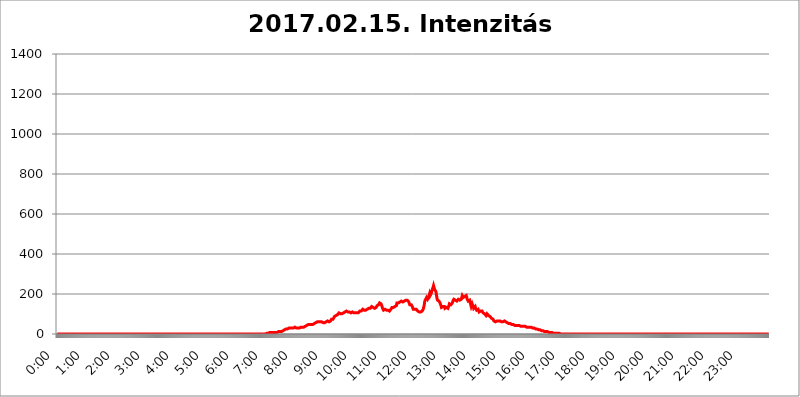
| Category | 2017.02.15. Intenzitás [W/m^2] |
|---|---|
| 0.0 | 0 |
| 0.0006944444444444445 | 0 |
| 0.001388888888888889 | 0 |
| 0.0020833333333333333 | 0 |
| 0.002777777777777778 | 0 |
| 0.003472222222222222 | 0 |
| 0.004166666666666667 | 0 |
| 0.004861111111111111 | 0 |
| 0.005555555555555556 | 0 |
| 0.0062499999999999995 | 0 |
| 0.006944444444444444 | 0 |
| 0.007638888888888889 | 0 |
| 0.008333333333333333 | 0 |
| 0.009027777777777779 | 0 |
| 0.009722222222222222 | 0 |
| 0.010416666666666666 | 0 |
| 0.011111111111111112 | 0 |
| 0.011805555555555555 | 0 |
| 0.012499999999999999 | 0 |
| 0.013194444444444444 | 0 |
| 0.013888888888888888 | 0 |
| 0.014583333333333332 | 0 |
| 0.015277777777777777 | 0 |
| 0.015972222222222224 | 0 |
| 0.016666666666666666 | 0 |
| 0.017361111111111112 | 0 |
| 0.018055555555555557 | 0 |
| 0.01875 | 0 |
| 0.019444444444444445 | 0 |
| 0.02013888888888889 | 0 |
| 0.020833333333333332 | 0 |
| 0.02152777777777778 | 0 |
| 0.022222222222222223 | 0 |
| 0.02291666666666667 | 0 |
| 0.02361111111111111 | 0 |
| 0.024305555555555556 | 0 |
| 0.024999999999999998 | 0 |
| 0.025694444444444447 | 0 |
| 0.02638888888888889 | 0 |
| 0.027083333333333334 | 0 |
| 0.027777777777777776 | 0 |
| 0.02847222222222222 | 0 |
| 0.029166666666666664 | 0 |
| 0.029861111111111113 | 0 |
| 0.030555555555555555 | 0 |
| 0.03125 | 0 |
| 0.03194444444444445 | 0 |
| 0.03263888888888889 | 0 |
| 0.03333333333333333 | 0 |
| 0.034027777777777775 | 0 |
| 0.034722222222222224 | 0 |
| 0.035416666666666666 | 0 |
| 0.036111111111111115 | 0 |
| 0.03680555555555556 | 0 |
| 0.0375 | 0 |
| 0.03819444444444444 | 0 |
| 0.03888888888888889 | 0 |
| 0.03958333333333333 | 0 |
| 0.04027777777777778 | 0 |
| 0.04097222222222222 | 0 |
| 0.041666666666666664 | 0 |
| 0.042361111111111106 | 0 |
| 0.04305555555555556 | 0 |
| 0.043750000000000004 | 0 |
| 0.044444444444444446 | 0 |
| 0.04513888888888889 | 0 |
| 0.04583333333333334 | 0 |
| 0.04652777777777778 | 0 |
| 0.04722222222222222 | 0 |
| 0.04791666666666666 | 0 |
| 0.04861111111111111 | 0 |
| 0.049305555555555554 | 0 |
| 0.049999999999999996 | 0 |
| 0.05069444444444445 | 0 |
| 0.051388888888888894 | 0 |
| 0.052083333333333336 | 0 |
| 0.05277777777777778 | 0 |
| 0.05347222222222222 | 0 |
| 0.05416666666666667 | 0 |
| 0.05486111111111111 | 0 |
| 0.05555555555555555 | 0 |
| 0.05625 | 0 |
| 0.05694444444444444 | 0 |
| 0.057638888888888885 | 0 |
| 0.05833333333333333 | 0 |
| 0.05902777777777778 | 0 |
| 0.059722222222222225 | 0 |
| 0.06041666666666667 | 0 |
| 0.061111111111111116 | 0 |
| 0.06180555555555556 | 0 |
| 0.0625 | 0 |
| 0.06319444444444444 | 0 |
| 0.06388888888888888 | 0 |
| 0.06458333333333334 | 0 |
| 0.06527777777777778 | 0 |
| 0.06597222222222222 | 0 |
| 0.06666666666666667 | 0 |
| 0.06736111111111111 | 0 |
| 0.06805555555555555 | 0 |
| 0.06874999999999999 | 0 |
| 0.06944444444444443 | 0 |
| 0.07013888888888889 | 0 |
| 0.07083333333333333 | 0 |
| 0.07152777777777779 | 0 |
| 0.07222222222222223 | 0 |
| 0.07291666666666667 | 0 |
| 0.07361111111111111 | 0 |
| 0.07430555555555556 | 0 |
| 0.075 | 0 |
| 0.07569444444444444 | 0 |
| 0.0763888888888889 | 0 |
| 0.07708333333333334 | 0 |
| 0.07777777777777778 | 0 |
| 0.07847222222222222 | 0 |
| 0.07916666666666666 | 0 |
| 0.0798611111111111 | 0 |
| 0.08055555555555556 | 0 |
| 0.08125 | 0 |
| 0.08194444444444444 | 0 |
| 0.08263888888888889 | 0 |
| 0.08333333333333333 | 0 |
| 0.08402777777777777 | 0 |
| 0.08472222222222221 | 0 |
| 0.08541666666666665 | 0 |
| 0.08611111111111112 | 0 |
| 0.08680555555555557 | 0 |
| 0.08750000000000001 | 0 |
| 0.08819444444444445 | 0 |
| 0.08888888888888889 | 0 |
| 0.08958333333333333 | 0 |
| 0.09027777777777778 | 0 |
| 0.09097222222222222 | 0 |
| 0.09166666666666667 | 0 |
| 0.09236111111111112 | 0 |
| 0.09305555555555556 | 0 |
| 0.09375 | 0 |
| 0.09444444444444444 | 0 |
| 0.09513888888888888 | 0 |
| 0.09583333333333333 | 0 |
| 0.09652777777777777 | 0 |
| 0.09722222222222222 | 0 |
| 0.09791666666666667 | 0 |
| 0.09861111111111111 | 0 |
| 0.09930555555555555 | 0 |
| 0.09999999999999999 | 0 |
| 0.10069444444444443 | 0 |
| 0.1013888888888889 | 0 |
| 0.10208333333333335 | 0 |
| 0.10277777777777779 | 0 |
| 0.10347222222222223 | 0 |
| 0.10416666666666667 | 0 |
| 0.10486111111111111 | 0 |
| 0.10555555555555556 | 0 |
| 0.10625 | 0 |
| 0.10694444444444444 | 0 |
| 0.1076388888888889 | 0 |
| 0.10833333333333334 | 0 |
| 0.10902777777777778 | 0 |
| 0.10972222222222222 | 0 |
| 0.1111111111111111 | 0 |
| 0.11180555555555556 | 0 |
| 0.11180555555555556 | 0 |
| 0.1125 | 0 |
| 0.11319444444444444 | 0 |
| 0.11388888888888889 | 0 |
| 0.11458333333333333 | 0 |
| 0.11527777777777777 | 0 |
| 0.11597222222222221 | 0 |
| 0.11666666666666665 | 0 |
| 0.1173611111111111 | 0 |
| 0.11805555555555557 | 0 |
| 0.11944444444444445 | 0 |
| 0.12013888888888889 | 0 |
| 0.12083333333333333 | 0 |
| 0.12152777777777778 | 0 |
| 0.12222222222222223 | 0 |
| 0.12291666666666667 | 0 |
| 0.12291666666666667 | 0 |
| 0.12361111111111112 | 0 |
| 0.12430555555555556 | 0 |
| 0.125 | 0 |
| 0.12569444444444444 | 0 |
| 0.12638888888888888 | 0 |
| 0.12708333333333333 | 0 |
| 0.16875 | 0 |
| 0.12847222222222224 | 0 |
| 0.12916666666666668 | 0 |
| 0.12986111111111112 | 0 |
| 0.13055555555555556 | 0 |
| 0.13125 | 0 |
| 0.13194444444444445 | 0 |
| 0.1326388888888889 | 0 |
| 0.13333333333333333 | 0 |
| 0.13402777777777777 | 0 |
| 0.13402777777777777 | 0 |
| 0.13472222222222222 | 0 |
| 0.13541666666666666 | 0 |
| 0.1361111111111111 | 0 |
| 0.13749999999999998 | 0 |
| 0.13819444444444443 | 0 |
| 0.1388888888888889 | 0 |
| 0.13958333333333334 | 0 |
| 0.14027777777777778 | 0 |
| 0.14097222222222222 | 0 |
| 0.14166666666666666 | 0 |
| 0.1423611111111111 | 0 |
| 0.14305555555555557 | 0 |
| 0.14375000000000002 | 0 |
| 0.14444444444444446 | 0 |
| 0.1451388888888889 | 0 |
| 0.1451388888888889 | 0 |
| 0.14652777777777778 | 0 |
| 0.14722222222222223 | 0 |
| 0.14791666666666667 | 0 |
| 0.1486111111111111 | 0 |
| 0.14930555555555555 | 0 |
| 0.15 | 0 |
| 0.15069444444444444 | 0 |
| 0.15138888888888888 | 0 |
| 0.15208333333333332 | 0 |
| 0.15277777777777776 | 0 |
| 0.15347222222222223 | 0 |
| 0.15416666666666667 | 0 |
| 0.15486111111111112 | 0 |
| 0.15555555555555556 | 0 |
| 0.15625 | 0 |
| 0.15694444444444444 | 0 |
| 0.15763888888888888 | 0 |
| 0.15833333333333333 | 0 |
| 0.15902777777777777 | 0 |
| 0.15972222222222224 | 0 |
| 0.16041666666666668 | 0 |
| 0.16111111111111112 | 0 |
| 0.16180555555555556 | 0 |
| 0.1625 | 0 |
| 0.16319444444444445 | 0 |
| 0.1638888888888889 | 0 |
| 0.16458333333333333 | 0 |
| 0.16527777777777777 | 0 |
| 0.16597222222222222 | 0 |
| 0.16666666666666666 | 0 |
| 0.1673611111111111 | 0 |
| 0.16805555555555554 | 0 |
| 0.16874999999999998 | 0 |
| 0.16944444444444443 | 0 |
| 0.17013888888888887 | 0 |
| 0.1708333333333333 | 0 |
| 0.17152777777777775 | 0 |
| 0.17222222222222225 | 0 |
| 0.1729166666666667 | 0 |
| 0.17361111111111113 | 0 |
| 0.17430555555555557 | 0 |
| 0.17500000000000002 | 0 |
| 0.17569444444444446 | 0 |
| 0.1763888888888889 | 0 |
| 0.17708333333333334 | 0 |
| 0.17777777777777778 | 0 |
| 0.17847222222222223 | 0 |
| 0.17916666666666667 | 0 |
| 0.1798611111111111 | 0 |
| 0.18055555555555555 | 0 |
| 0.18125 | 0 |
| 0.18194444444444444 | 0 |
| 0.1826388888888889 | 0 |
| 0.18333333333333335 | 0 |
| 0.1840277777777778 | 0 |
| 0.18472222222222223 | 0 |
| 0.18541666666666667 | 0 |
| 0.18611111111111112 | 0 |
| 0.18680555555555556 | 0 |
| 0.1875 | 0 |
| 0.18819444444444444 | 0 |
| 0.18888888888888888 | 0 |
| 0.18958333333333333 | 0 |
| 0.19027777777777777 | 0 |
| 0.1909722222222222 | 0 |
| 0.19166666666666665 | 0 |
| 0.19236111111111112 | 0 |
| 0.19305555555555554 | 0 |
| 0.19375 | 0 |
| 0.19444444444444445 | 0 |
| 0.1951388888888889 | 0 |
| 0.19583333333333333 | 0 |
| 0.19652777777777777 | 0 |
| 0.19722222222222222 | 0 |
| 0.19791666666666666 | 0 |
| 0.1986111111111111 | 0 |
| 0.19930555555555554 | 0 |
| 0.19999999999999998 | 0 |
| 0.20069444444444443 | 0 |
| 0.20138888888888887 | 0 |
| 0.2020833333333333 | 0 |
| 0.2027777777777778 | 0 |
| 0.2034722222222222 | 0 |
| 0.2041666666666667 | 0 |
| 0.20486111111111113 | 0 |
| 0.20555555555555557 | 0 |
| 0.20625000000000002 | 0 |
| 0.20694444444444446 | 0 |
| 0.2076388888888889 | 0 |
| 0.20833333333333334 | 0 |
| 0.20902777777777778 | 0 |
| 0.20972222222222223 | 0 |
| 0.21041666666666667 | 0 |
| 0.2111111111111111 | 0 |
| 0.21180555555555555 | 0 |
| 0.2125 | 0 |
| 0.21319444444444444 | 0 |
| 0.2138888888888889 | 0 |
| 0.21458333333333335 | 0 |
| 0.2152777777777778 | 0 |
| 0.21597222222222223 | 0 |
| 0.21666666666666667 | 0 |
| 0.21736111111111112 | 0 |
| 0.21805555555555556 | 0 |
| 0.21875 | 0 |
| 0.21944444444444444 | 0 |
| 0.22013888888888888 | 0 |
| 0.22083333333333333 | 0 |
| 0.22152777777777777 | 0 |
| 0.2222222222222222 | 0 |
| 0.22291666666666665 | 0 |
| 0.2236111111111111 | 0 |
| 0.22430555555555556 | 0 |
| 0.225 | 0 |
| 0.22569444444444445 | 0 |
| 0.2263888888888889 | 0 |
| 0.22708333333333333 | 0 |
| 0.22777777777777777 | 0 |
| 0.22847222222222222 | 0 |
| 0.22916666666666666 | 0 |
| 0.2298611111111111 | 0 |
| 0.23055555555555554 | 0 |
| 0.23124999999999998 | 0 |
| 0.23194444444444443 | 0 |
| 0.23263888888888887 | 0 |
| 0.2333333333333333 | 0 |
| 0.2340277777777778 | 0 |
| 0.2347222222222222 | 0 |
| 0.2354166666666667 | 0 |
| 0.23611111111111113 | 0 |
| 0.23680555555555557 | 0 |
| 0.23750000000000002 | 0 |
| 0.23819444444444446 | 0 |
| 0.2388888888888889 | 0 |
| 0.23958333333333334 | 0 |
| 0.24027777777777778 | 0 |
| 0.24097222222222223 | 0 |
| 0.24166666666666667 | 0 |
| 0.2423611111111111 | 0 |
| 0.24305555555555555 | 0 |
| 0.24375 | 0 |
| 0.24444444444444446 | 0 |
| 0.24513888888888888 | 0 |
| 0.24583333333333335 | 0 |
| 0.2465277777777778 | 0 |
| 0.24722222222222223 | 0 |
| 0.24791666666666667 | 0 |
| 0.24861111111111112 | 0 |
| 0.24930555555555556 | 0 |
| 0.25 | 0 |
| 0.25069444444444444 | 0 |
| 0.2513888888888889 | 0 |
| 0.2520833333333333 | 0 |
| 0.25277777777777777 | 0 |
| 0.2534722222222222 | 0 |
| 0.25416666666666665 | 0 |
| 0.2548611111111111 | 0 |
| 0.2555555555555556 | 0 |
| 0.25625000000000003 | 0 |
| 0.2569444444444445 | 0 |
| 0.2576388888888889 | 0 |
| 0.25833333333333336 | 0 |
| 0.2590277777777778 | 0 |
| 0.25972222222222224 | 0 |
| 0.2604166666666667 | 0 |
| 0.2611111111111111 | 0 |
| 0.26180555555555557 | 0 |
| 0.2625 | 0 |
| 0.26319444444444445 | 0 |
| 0.2638888888888889 | 0 |
| 0.26458333333333334 | 0 |
| 0.2652777777777778 | 0 |
| 0.2659722222222222 | 0 |
| 0.26666666666666666 | 0 |
| 0.2673611111111111 | 0 |
| 0.26805555555555555 | 0 |
| 0.26875 | 0 |
| 0.26944444444444443 | 0 |
| 0.2701388888888889 | 0 |
| 0.2708333333333333 | 0 |
| 0.27152777777777776 | 0 |
| 0.2722222222222222 | 0 |
| 0.27291666666666664 | 0 |
| 0.2736111111111111 | 0 |
| 0.2743055555555555 | 0 |
| 0.27499999999999997 | 0 |
| 0.27569444444444446 | 0 |
| 0.27638888888888885 | 0 |
| 0.27708333333333335 | 0 |
| 0.2777777777777778 | 0 |
| 0.27847222222222223 | 0 |
| 0.2791666666666667 | 0 |
| 0.2798611111111111 | 0 |
| 0.28055555555555556 | 0 |
| 0.28125 | 0 |
| 0.28194444444444444 | 0 |
| 0.2826388888888889 | 0 |
| 0.2833333333333333 | 0 |
| 0.28402777777777777 | 0 |
| 0.2847222222222222 | 0 |
| 0.28541666666666665 | 0 |
| 0.28611111111111115 | 0 |
| 0.28680555555555554 | 0 |
| 0.28750000000000003 | 0 |
| 0.2881944444444445 | 0 |
| 0.2888888888888889 | 0 |
| 0.28958333333333336 | 0 |
| 0.2902777777777778 | 0 |
| 0.29097222222222224 | 0 |
| 0.2916666666666667 | 0 |
| 0.2923611111111111 | 0 |
| 0.29305555555555557 | 3.525 |
| 0.29375 | 3.525 |
| 0.29444444444444445 | 3.525 |
| 0.2951388888888889 | 3.525 |
| 0.29583333333333334 | 3.525 |
| 0.2965277777777778 | 3.525 |
| 0.2972222222222222 | 7.887 |
| 0.29791666666666666 | 7.887 |
| 0.2986111111111111 | 7.887 |
| 0.29930555555555555 | 7.887 |
| 0.3 | 7.887 |
| 0.30069444444444443 | 7.887 |
| 0.3013888888888889 | 7.887 |
| 0.3020833333333333 | 7.887 |
| 0.30277777777777776 | 7.887 |
| 0.3034722222222222 | 7.887 |
| 0.30416666666666664 | 7.887 |
| 0.3048611111111111 | 7.887 |
| 0.3055555555555555 | 7.887 |
| 0.30624999999999997 | 7.887 |
| 0.3069444444444444 | 7.887 |
| 0.3076388888888889 | 7.887 |
| 0.30833333333333335 | 7.887 |
| 0.3090277777777778 | 12.257 |
| 0.30972222222222223 | 12.257 |
| 0.3104166666666667 | 12.257 |
| 0.3111111111111111 | 12.257 |
| 0.31180555555555556 | 12.257 |
| 0.3125 | 12.257 |
| 0.31319444444444444 | 12.257 |
| 0.3138888888888889 | 12.257 |
| 0.3145833333333333 | 12.257 |
| 0.31527777777777777 | 12.257 |
| 0.3159722222222222 | 12.257 |
| 0.31666666666666665 | 16.636 |
| 0.31736111111111115 | 16.636 |
| 0.31805555555555554 | 16.636 |
| 0.31875000000000003 | 21.024 |
| 0.3194444444444445 | 21.024 |
| 0.3201388888888889 | 21.024 |
| 0.32083333333333336 | 25.419 |
| 0.3215277777777778 | 25.419 |
| 0.32222222222222224 | 25.419 |
| 0.3229166666666667 | 25.419 |
| 0.3236111111111111 | 25.419 |
| 0.32430555555555557 | 29.823 |
| 0.325 | 29.823 |
| 0.32569444444444445 | 29.823 |
| 0.3263888888888889 | 29.823 |
| 0.32708333333333334 | 29.823 |
| 0.3277777777777778 | 29.823 |
| 0.3284722222222222 | 29.823 |
| 0.32916666666666666 | 29.823 |
| 0.3298611111111111 | 29.823 |
| 0.33055555555555555 | 29.823 |
| 0.33125 | 29.823 |
| 0.33194444444444443 | 34.234 |
| 0.3326388888888889 | 34.234 |
| 0.3333333333333333 | 34.234 |
| 0.3340277777777778 | 34.234 |
| 0.3347222222222222 | 29.823 |
| 0.3354166666666667 | 29.823 |
| 0.3361111111111111 | 29.823 |
| 0.3368055555555556 | 29.823 |
| 0.33749999999999997 | 29.823 |
| 0.33819444444444446 | 29.823 |
| 0.33888888888888885 | 34.234 |
| 0.33958333333333335 | 29.823 |
| 0.34027777777777773 | 29.823 |
| 0.34097222222222223 | 29.823 |
| 0.3416666666666666 | 34.234 |
| 0.3423611111111111 | 34.234 |
| 0.3430555555555555 | 34.234 |
| 0.34375 | 34.234 |
| 0.3444444444444445 | 34.234 |
| 0.3451388888888889 | 34.234 |
| 0.3458333333333334 | 34.234 |
| 0.34652777777777777 | 34.234 |
| 0.34722222222222227 | 34.234 |
| 0.34791666666666665 | 38.653 |
| 0.34861111111111115 | 38.653 |
| 0.34930555555555554 | 38.653 |
| 0.35000000000000003 | 43.079 |
| 0.3506944444444444 | 43.079 |
| 0.3513888888888889 | 43.079 |
| 0.3520833333333333 | 47.511 |
| 0.3527777777777778 | 47.511 |
| 0.3534722222222222 | 47.511 |
| 0.3541666666666667 | 47.511 |
| 0.3548611111111111 | 47.511 |
| 0.35555555555555557 | 47.511 |
| 0.35625 | 47.511 |
| 0.35694444444444445 | 47.511 |
| 0.3576388888888889 | 47.511 |
| 0.35833333333333334 | 47.511 |
| 0.3590277777777778 | 47.511 |
| 0.3597222222222222 | 47.511 |
| 0.36041666666666666 | 51.951 |
| 0.3611111111111111 | 51.951 |
| 0.36180555555555555 | 56.398 |
| 0.3625 | 56.398 |
| 0.36319444444444443 | 56.398 |
| 0.3638888888888889 | 56.398 |
| 0.3645833333333333 | 60.85 |
| 0.3652777777777778 | 60.85 |
| 0.3659722222222222 | 60.85 |
| 0.3666666666666667 | 60.85 |
| 0.3673611111111111 | 60.85 |
| 0.3680555555555556 | 60.85 |
| 0.36874999999999997 | 60.85 |
| 0.36944444444444446 | 60.85 |
| 0.37013888888888885 | 60.85 |
| 0.37083333333333335 | 60.85 |
| 0.37152777777777773 | 60.85 |
| 0.37222222222222223 | 60.85 |
| 0.3729166666666666 | 56.398 |
| 0.3736111111111111 | 56.398 |
| 0.3743055555555555 | 56.398 |
| 0.375 | 56.398 |
| 0.3756944444444445 | 56.398 |
| 0.3763888888888889 | 56.398 |
| 0.3770833333333334 | 60.85 |
| 0.37777777777777777 | 60.85 |
| 0.37847222222222227 | 65.31 |
| 0.37916666666666665 | 65.31 |
| 0.37986111111111115 | 60.85 |
| 0.38055555555555554 | 60.85 |
| 0.38125000000000003 | 60.85 |
| 0.3819444444444444 | 65.31 |
| 0.3826388888888889 | 60.85 |
| 0.3833333333333333 | 65.31 |
| 0.3840277777777778 | 65.31 |
| 0.3847222222222222 | 74.246 |
| 0.3854166666666667 | 78.722 |
| 0.3861111111111111 | 74.246 |
| 0.38680555555555557 | 74.246 |
| 0.3875 | 74.246 |
| 0.38819444444444445 | 78.722 |
| 0.3888888888888889 | 87.692 |
| 0.38958333333333334 | 92.184 |
| 0.3902777777777778 | 87.692 |
| 0.3909722222222222 | 92.184 |
| 0.39166666666666666 | 92.184 |
| 0.3923611111111111 | 92.184 |
| 0.39305555555555555 | 96.682 |
| 0.39375 | 101.184 |
| 0.39444444444444443 | 101.184 |
| 0.3951388888888889 | 105.69 |
| 0.3958333333333333 | 105.69 |
| 0.3965277777777778 | 105.69 |
| 0.3972222222222222 | 101.184 |
| 0.3979166666666667 | 101.184 |
| 0.3986111111111111 | 101.184 |
| 0.3993055555555556 | 101.184 |
| 0.39999999999999997 | 105.69 |
| 0.40069444444444446 | 105.69 |
| 0.40138888888888885 | 105.69 |
| 0.40208333333333335 | 105.69 |
| 0.40277777777777773 | 110.201 |
| 0.40347222222222223 | 110.201 |
| 0.4041666666666666 | 110.201 |
| 0.4048611111111111 | 110.201 |
| 0.4055555555555555 | 114.716 |
| 0.40625 | 110.201 |
| 0.4069444444444445 | 110.201 |
| 0.4076388888888889 | 110.201 |
| 0.4083333333333334 | 110.201 |
| 0.40902777777777777 | 110.201 |
| 0.40972222222222227 | 110.201 |
| 0.41041666666666665 | 110.201 |
| 0.41111111111111115 | 110.201 |
| 0.41180555555555554 | 105.69 |
| 0.41250000000000003 | 105.69 |
| 0.4131944444444444 | 105.69 |
| 0.4138888888888889 | 110.201 |
| 0.4145833333333333 | 110.201 |
| 0.4152777777777778 | 110.201 |
| 0.4159722222222222 | 105.69 |
| 0.4166666666666667 | 105.69 |
| 0.4173611111111111 | 105.69 |
| 0.41805555555555557 | 105.69 |
| 0.41875 | 105.69 |
| 0.41944444444444445 | 105.69 |
| 0.4201388888888889 | 105.69 |
| 0.42083333333333334 | 105.69 |
| 0.4215277777777778 | 105.69 |
| 0.4222222222222222 | 105.69 |
| 0.42291666666666666 | 105.69 |
| 0.4236111111111111 | 110.201 |
| 0.42430555555555555 | 114.716 |
| 0.425 | 110.201 |
| 0.42569444444444443 | 110.201 |
| 0.4263888888888889 | 114.716 |
| 0.4270833333333333 | 119.235 |
| 0.4277777777777778 | 119.235 |
| 0.4284722222222222 | 123.758 |
| 0.4291666666666667 | 123.758 |
| 0.4298611111111111 | 119.235 |
| 0.4305555555555556 | 119.235 |
| 0.43124999999999997 | 119.235 |
| 0.43194444444444446 | 119.235 |
| 0.43263888888888885 | 119.235 |
| 0.43333333333333335 | 119.235 |
| 0.43402777777777773 | 119.235 |
| 0.43472222222222223 | 123.758 |
| 0.4354166666666666 | 128.284 |
| 0.4361111111111111 | 128.284 |
| 0.4368055555555555 | 128.284 |
| 0.4375 | 128.284 |
| 0.4381944444444445 | 132.814 |
| 0.4388888888888889 | 128.284 |
| 0.4395833333333334 | 128.284 |
| 0.44027777777777777 | 132.814 |
| 0.44097222222222227 | 137.347 |
| 0.44166666666666665 | 137.347 |
| 0.44236111111111115 | 132.814 |
| 0.44305555555555554 | 132.814 |
| 0.44375000000000003 | 132.814 |
| 0.4444444444444444 | 132.814 |
| 0.4451388888888889 | 128.284 |
| 0.4458333333333333 | 128.284 |
| 0.4465277777777778 | 132.814 |
| 0.4472222222222222 | 132.814 |
| 0.4479166666666667 | 137.347 |
| 0.4486111111111111 | 141.884 |
| 0.44930555555555557 | 141.884 |
| 0.45 | 146.423 |
| 0.45069444444444445 | 146.423 |
| 0.4513888888888889 | 150.964 |
| 0.45208333333333334 | 155.509 |
| 0.4527777777777778 | 155.509 |
| 0.4534722222222222 | 155.509 |
| 0.45416666666666666 | 150.964 |
| 0.4548611111111111 | 146.423 |
| 0.45555555555555555 | 137.347 |
| 0.45625 | 128.284 |
| 0.45694444444444443 | 123.758 |
| 0.4576388888888889 | 119.235 |
| 0.4583333333333333 | 119.235 |
| 0.4590277777777778 | 123.758 |
| 0.4597222222222222 | 123.758 |
| 0.4604166666666667 | 123.758 |
| 0.4611111111111111 | 119.235 |
| 0.4618055555555556 | 119.235 |
| 0.46249999999999997 | 119.235 |
| 0.46319444444444446 | 119.235 |
| 0.46388888888888885 | 119.235 |
| 0.46458333333333335 | 114.716 |
| 0.46527777777777773 | 114.716 |
| 0.46597222222222223 | 114.716 |
| 0.4666666666666666 | 119.235 |
| 0.4673611111111111 | 119.235 |
| 0.4680555555555555 | 123.758 |
| 0.46875 | 128.284 |
| 0.4694444444444445 | 132.814 |
| 0.4701388888888889 | 137.347 |
| 0.4708333333333334 | 132.814 |
| 0.47152777777777777 | 132.814 |
| 0.47222222222222227 | 137.347 |
| 0.47291666666666665 | 137.347 |
| 0.47361111111111115 | 137.347 |
| 0.47430555555555554 | 137.347 |
| 0.47500000000000003 | 137.347 |
| 0.4756944444444444 | 141.884 |
| 0.4763888888888889 | 155.509 |
| 0.4770833333333333 | 155.509 |
| 0.4777777777777778 | 155.509 |
| 0.4784722222222222 | 155.509 |
| 0.4791666666666667 | 150.964 |
| 0.4798611111111111 | 155.509 |
| 0.48055555555555557 | 160.056 |
| 0.48125 | 155.509 |
| 0.48194444444444445 | 160.056 |
| 0.4826388888888889 | 164.605 |
| 0.48333333333333334 | 164.605 |
| 0.4840277777777778 | 164.605 |
| 0.4847222222222222 | 160.056 |
| 0.48541666666666666 | 160.056 |
| 0.4861111111111111 | 160.056 |
| 0.48680555555555555 | 164.605 |
| 0.4875 | 169.156 |
| 0.48819444444444443 | 169.156 |
| 0.4888888888888889 | 169.156 |
| 0.4895833333333333 | 164.605 |
| 0.4902777777777778 | 164.605 |
| 0.4909722222222222 | 169.156 |
| 0.4916666666666667 | 164.605 |
| 0.4923611111111111 | 164.605 |
| 0.4930555555555556 | 160.056 |
| 0.49374999999999997 | 155.509 |
| 0.49444444444444446 | 146.423 |
| 0.49513888888888885 | 146.423 |
| 0.49583333333333335 | 146.423 |
| 0.49652777777777773 | 146.423 |
| 0.49722222222222223 | 146.423 |
| 0.4979166666666666 | 137.347 |
| 0.4986111111111111 | 132.814 |
| 0.4993055555555555 | 123.758 |
| 0.5 | 123.758 |
| 0.5006944444444444 | 123.758 |
| 0.5013888888888889 | 123.758 |
| 0.5020833333333333 | 119.235 |
| 0.5027777777777778 | 119.235 |
| 0.5034722222222222 | 123.758 |
| 0.5041666666666667 | 123.758 |
| 0.5048611111111111 | 119.235 |
| 0.5055555555555555 | 114.716 |
| 0.50625 | 114.716 |
| 0.5069444444444444 | 114.716 |
| 0.5076388888888889 | 110.201 |
| 0.5083333333333333 | 105.69 |
| 0.5090277777777777 | 105.69 |
| 0.5097222222222222 | 110.201 |
| 0.5104166666666666 | 105.69 |
| 0.5111111111111112 | 110.201 |
| 0.5118055555555555 | 114.716 |
| 0.5125000000000001 | 119.235 |
| 0.5131944444444444 | 123.758 |
| 0.513888888888889 | 128.284 |
| 0.5145833333333333 | 141.884 |
| 0.5152777777777778 | 160.056 |
| 0.5159722222222222 | 169.156 |
| 0.5166666666666667 | 169.156 |
| 0.517361111111111 | 173.709 |
| 0.5180555555555556 | 182.82 |
| 0.5187499999999999 | 178.264 |
| 0.5194444444444445 | 173.709 |
| 0.5201388888888888 | 173.709 |
| 0.5208333333333334 | 182.82 |
| 0.5215277777777778 | 191.937 |
| 0.5222222222222223 | 201.058 |
| 0.5229166666666667 | 191.937 |
| 0.5236111111111111 | 187.378 |
| 0.5243055555555556 | 201.058 |
| 0.525 | 210.182 |
| 0.5256944444444445 | 219.309 |
| 0.5263888888888889 | 219.309 |
| 0.5270833333333333 | 233 |
| 0.5277777777777778 | 242.127 |
| 0.5284722222222222 | 233 |
| 0.5291666666666667 | 223.873 |
| 0.5298611111111111 | 228.436 |
| 0.5305555555555556 | 228.436 |
| 0.53125 | 210.182 |
| 0.5319444444444444 | 191.937 |
| 0.5326388888888889 | 178.264 |
| 0.5333333333333333 | 169.156 |
| 0.5340277777777778 | 164.605 |
| 0.5347222222222222 | 164.605 |
| 0.5354166666666667 | 164.605 |
| 0.5361111111111111 | 164.605 |
| 0.5368055555555555 | 155.509 |
| 0.5375 | 150.964 |
| 0.5381944444444444 | 141.884 |
| 0.5388888888888889 | 132.814 |
| 0.5395833333333333 | 132.814 |
| 0.5402777777777777 | 132.814 |
| 0.5409722222222222 | 137.347 |
| 0.5416666666666666 | 137.347 |
| 0.5423611111111112 | 137.347 |
| 0.5430555555555555 | 137.347 |
| 0.5437500000000001 | 128.284 |
| 0.5444444444444444 | 128.284 |
| 0.545138888888889 | 128.284 |
| 0.5458333333333333 | 132.814 |
| 0.5465277777777778 | 132.814 |
| 0.5472222222222222 | 128.284 |
| 0.5479166666666667 | 128.284 |
| 0.548611111111111 | 132.814 |
| 0.5493055555555556 | 141.884 |
| 0.5499999999999999 | 150.964 |
| 0.5506944444444445 | 155.509 |
| 0.5513888888888888 | 155.509 |
| 0.5520833333333334 | 146.423 |
| 0.5527777777777778 | 146.423 |
| 0.5534722222222223 | 146.423 |
| 0.5541666666666667 | 155.509 |
| 0.5548611111111111 | 164.605 |
| 0.5555555555555556 | 169.156 |
| 0.55625 | 173.709 |
| 0.5569444444444445 | 173.709 |
| 0.5576388888888889 | 169.156 |
| 0.5583333333333333 | 169.156 |
| 0.5590277777777778 | 164.605 |
| 0.5597222222222222 | 164.605 |
| 0.5604166666666667 | 164.605 |
| 0.5611111111111111 | 164.605 |
| 0.5618055555555556 | 169.156 |
| 0.5625 | 173.709 |
| 0.5631944444444444 | 173.709 |
| 0.5638888888888889 | 173.709 |
| 0.5645833333333333 | 169.156 |
| 0.5652777777777778 | 164.605 |
| 0.5659722222222222 | 164.605 |
| 0.5666666666666667 | 173.709 |
| 0.5673611111111111 | 182.82 |
| 0.5680555555555555 | 191.937 |
| 0.56875 | 191.937 |
| 0.5694444444444444 | 182.82 |
| 0.5701388888888889 | 182.82 |
| 0.5708333333333333 | 182.82 |
| 0.5715277777777777 | 187.378 |
| 0.5722222222222222 | 187.378 |
| 0.5729166666666666 | 191.937 |
| 0.5736111111111112 | 191.937 |
| 0.5743055555555555 | 187.378 |
| 0.5750000000000001 | 173.709 |
| 0.5756944444444444 | 173.709 |
| 0.576388888888889 | 164.605 |
| 0.5770833333333333 | 160.056 |
| 0.5777777777777778 | 164.605 |
| 0.5784722222222222 | 169.156 |
| 0.5791666666666667 | 164.605 |
| 0.579861111111111 | 146.423 |
| 0.5805555555555556 | 137.347 |
| 0.5812499999999999 | 137.347 |
| 0.5819444444444445 | 150.964 |
| 0.5826388888888888 | 150.964 |
| 0.5833333333333334 | 137.347 |
| 0.5840277777777778 | 128.284 |
| 0.5847222222222223 | 123.758 |
| 0.5854166666666667 | 132.814 |
| 0.5861111111111111 | 137.347 |
| 0.5868055555555556 | 128.284 |
| 0.5875 | 123.758 |
| 0.5881944444444445 | 119.235 |
| 0.5888888888888889 | 119.235 |
| 0.5895833333333333 | 123.758 |
| 0.5902777777777778 | 123.758 |
| 0.5909722222222222 | 119.235 |
| 0.5916666666666667 | 110.201 |
| 0.5923611111111111 | 110.201 |
| 0.5930555555555556 | 110.201 |
| 0.59375 | 114.716 |
| 0.5944444444444444 | 114.716 |
| 0.5951388888888889 | 114.716 |
| 0.5958333333333333 | 114.716 |
| 0.5965277777777778 | 110.201 |
| 0.5972222222222222 | 105.69 |
| 0.5979166666666667 | 110.201 |
| 0.5986111111111111 | 105.69 |
| 0.5993055555555555 | 101.184 |
| 0.6 | 101.184 |
| 0.6006944444444444 | 96.682 |
| 0.6013888888888889 | 92.184 |
| 0.6020833333333333 | 96.682 |
| 0.6027777777777777 | 101.184 |
| 0.6034722222222222 | 101.184 |
| 0.6041666666666666 | 96.682 |
| 0.6048611111111112 | 92.184 |
| 0.6055555555555555 | 92.184 |
| 0.6062500000000001 | 87.692 |
| 0.6069444444444444 | 87.692 |
| 0.607638888888889 | 83.205 |
| 0.6083333333333333 | 83.205 |
| 0.6090277777777778 | 78.722 |
| 0.6097222222222222 | 74.246 |
| 0.6104166666666667 | 74.246 |
| 0.611111111111111 | 74.246 |
| 0.6118055555555556 | 69.775 |
| 0.6124999999999999 | 65.31 |
| 0.6131944444444445 | 65.31 |
| 0.6138888888888888 | 65.31 |
| 0.6145833333333334 | 60.85 |
| 0.6152777777777778 | 65.31 |
| 0.6159722222222223 | 65.31 |
| 0.6166666666666667 | 65.31 |
| 0.6173611111111111 | 65.31 |
| 0.6180555555555556 | 65.31 |
| 0.61875 | 65.31 |
| 0.6194444444444445 | 69.775 |
| 0.6201388888888889 | 69.775 |
| 0.6208333333333333 | 65.31 |
| 0.6215277777777778 | 65.31 |
| 0.6222222222222222 | 60.85 |
| 0.6229166666666667 | 60.85 |
| 0.6236111111111111 | 56.398 |
| 0.6243055555555556 | 56.398 |
| 0.625 | 60.85 |
| 0.6256944444444444 | 65.31 |
| 0.6263888888888889 | 65.31 |
| 0.6270833333333333 | 65.31 |
| 0.6277777777777778 | 65.31 |
| 0.6284722222222222 | 65.31 |
| 0.6291666666666667 | 60.85 |
| 0.6298611111111111 | 56.398 |
| 0.6305555555555555 | 56.398 |
| 0.63125 | 56.398 |
| 0.6319444444444444 | 51.951 |
| 0.6326388888888889 | 51.951 |
| 0.6333333333333333 | 51.951 |
| 0.6340277777777777 | 51.951 |
| 0.6347222222222222 | 51.951 |
| 0.6354166666666666 | 51.951 |
| 0.6361111111111112 | 51.951 |
| 0.6368055555555555 | 47.511 |
| 0.6375000000000001 | 47.511 |
| 0.6381944444444444 | 47.511 |
| 0.638888888888889 | 47.511 |
| 0.6395833333333333 | 47.511 |
| 0.6402777777777778 | 43.079 |
| 0.6409722222222222 | 43.079 |
| 0.6416666666666667 | 43.079 |
| 0.642361111111111 | 43.079 |
| 0.6430555555555556 | 43.079 |
| 0.6437499999999999 | 43.079 |
| 0.6444444444444445 | 38.653 |
| 0.6451388888888888 | 43.079 |
| 0.6458333333333334 | 43.079 |
| 0.6465277777777778 | 38.653 |
| 0.6472222222222223 | 38.653 |
| 0.6479166666666667 | 43.079 |
| 0.6486111111111111 | 43.079 |
| 0.6493055555555556 | 43.079 |
| 0.65 | 38.653 |
| 0.6506944444444445 | 38.653 |
| 0.6513888888888889 | 43.079 |
| 0.6520833333333333 | 38.653 |
| 0.6527777777777778 | 38.653 |
| 0.6534722222222222 | 38.653 |
| 0.6541666666666667 | 38.653 |
| 0.6548611111111111 | 38.653 |
| 0.6555555555555556 | 38.653 |
| 0.65625 | 38.653 |
| 0.6569444444444444 | 34.234 |
| 0.6576388888888889 | 34.234 |
| 0.6583333333333333 | 34.234 |
| 0.6590277777777778 | 34.234 |
| 0.6597222222222222 | 34.234 |
| 0.6604166666666667 | 34.234 |
| 0.6611111111111111 | 34.234 |
| 0.6618055555555555 | 34.234 |
| 0.6625 | 34.234 |
| 0.6631944444444444 | 38.653 |
| 0.6638888888888889 | 34.234 |
| 0.6645833333333333 | 34.234 |
| 0.6652777777777777 | 34.234 |
| 0.6659722222222222 | 34.234 |
| 0.6666666666666666 | 29.823 |
| 0.6673611111111111 | 29.823 |
| 0.6680555555555556 | 29.823 |
| 0.6687500000000001 | 29.823 |
| 0.6694444444444444 | 29.823 |
| 0.6701388888888888 | 25.419 |
| 0.6708333333333334 | 25.419 |
| 0.6715277777777778 | 25.419 |
| 0.6722222222222222 | 25.419 |
| 0.6729166666666666 | 25.419 |
| 0.6736111111111112 | 25.419 |
| 0.6743055555555556 | 21.024 |
| 0.6749999999999999 | 21.024 |
| 0.6756944444444444 | 21.024 |
| 0.6763888888888889 | 21.024 |
| 0.6770833333333334 | 21.024 |
| 0.6777777777777777 | 21.024 |
| 0.6784722222222223 | 16.636 |
| 0.6791666666666667 | 16.636 |
| 0.6798611111111111 | 16.636 |
| 0.6805555555555555 | 16.636 |
| 0.68125 | 16.636 |
| 0.6819444444444445 | 16.636 |
| 0.6826388888888889 | 16.636 |
| 0.6833333333333332 | 12.257 |
| 0.6840277777777778 | 12.257 |
| 0.6847222222222222 | 12.257 |
| 0.6854166666666667 | 12.257 |
| 0.686111111111111 | 12.257 |
| 0.6868055555555556 | 12.257 |
| 0.6875 | 12.257 |
| 0.6881944444444444 | 12.257 |
| 0.688888888888889 | 12.257 |
| 0.6895833333333333 | 7.887 |
| 0.6902777777777778 | 7.887 |
| 0.6909722222222222 | 7.887 |
| 0.6916666666666668 | 7.887 |
| 0.6923611111111111 | 7.887 |
| 0.6930555555555555 | 7.887 |
| 0.69375 | 7.887 |
| 0.6944444444444445 | 3.525 |
| 0.6951388888888889 | 3.525 |
| 0.6958333333333333 | 3.525 |
| 0.6965277777777777 | 3.525 |
| 0.6972222222222223 | 3.525 |
| 0.6979166666666666 | 3.525 |
| 0.6986111111111111 | 3.525 |
| 0.6993055555555556 | 3.525 |
| 0.7000000000000001 | 3.525 |
| 0.7006944444444444 | 3.525 |
| 0.7013888888888888 | 3.525 |
| 0.7020833333333334 | 3.525 |
| 0.7027777777777778 | 3.525 |
| 0.7034722222222222 | 3.525 |
| 0.7041666666666666 | 3.525 |
| 0.7048611111111112 | 0 |
| 0.7055555555555556 | 0 |
| 0.7062499999999999 | 0 |
| 0.7069444444444444 | 0 |
| 0.7076388888888889 | 0 |
| 0.7083333333333334 | 0 |
| 0.7090277777777777 | 0 |
| 0.7097222222222223 | 0 |
| 0.7104166666666667 | 0 |
| 0.7111111111111111 | 0 |
| 0.7118055555555555 | 0 |
| 0.7125 | 0 |
| 0.7131944444444445 | 0 |
| 0.7138888888888889 | 0 |
| 0.7145833333333332 | 0 |
| 0.7152777777777778 | 0 |
| 0.7159722222222222 | 0 |
| 0.7166666666666667 | 0 |
| 0.717361111111111 | 0 |
| 0.7180555555555556 | 0 |
| 0.71875 | 0 |
| 0.7194444444444444 | 0 |
| 0.720138888888889 | 0 |
| 0.7208333333333333 | 0 |
| 0.7215277777777778 | 0 |
| 0.7222222222222222 | 0 |
| 0.7229166666666668 | 0 |
| 0.7236111111111111 | 0 |
| 0.7243055555555555 | 0 |
| 0.725 | 0 |
| 0.7256944444444445 | 0 |
| 0.7263888888888889 | 0 |
| 0.7270833333333333 | 0 |
| 0.7277777777777777 | 0 |
| 0.7284722222222223 | 0 |
| 0.7291666666666666 | 0 |
| 0.7298611111111111 | 0 |
| 0.7305555555555556 | 0 |
| 0.7312500000000001 | 0 |
| 0.7319444444444444 | 0 |
| 0.7326388888888888 | 0 |
| 0.7333333333333334 | 0 |
| 0.7340277777777778 | 0 |
| 0.7347222222222222 | 0 |
| 0.7354166666666666 | 0 |
| 0.7361111111111112 | 0 |
| 0.7368055555555556 | 0 |
| 0.7374999999999999 | 0 |
| 0.7381944444444444 | 0 |
| 0.7388888888888889 | 0 |
| 0.7395833333333334 | 0 |
| 0.7402777777777777 | 0 |
| 0.7409722222222223 | 0 |
| 0.7416666666666667 | 0 |
| 0.7423611111111111 | 0 |
| 0.7430555555555555 | 0 |
| 0.74375 | 0 |
| 0.7444444444444445 | 0 |
| 0.7451388888888889 | 0 |
| 0.7458333333333332 | 0 |
| 0.7465277777777778 | 0 |
| 0.7472222222222222 | 0 |
| 0.7479166666666667 | 0 |
| 0.748611111111111 | 0 |
| 0.7493055555555556 | 0 |
| 0.75 | 0 |
| 0.7506944444444444 | 0 |
| 0.751388888888889 | 0 |
| 0.7520833333333333 | 0 |
| 0.7527777777777778 | 0 |
| 0.7534722222222222 | 0 |
| 0.7541666666666668 | 0 |
| 0.7548611111111111 | 0 |
| 0.7555555555555555 | 0 |
| 0.75625 | 0 |
| 0.7569444444444445 | 0 |
| 0.7576388888888889 | 0 |
| 0.7583333333333333 | 0 |
| 0.7590277777777777 | 0 |
| 0.7597222222222223 | 0 |
| 0.7604166666666666 | 0 |
| 0.7611111111111111 | 0 |
| 0.7618055555555556 | 0 |
| 0.7625000000000001 | 0 |
| 0.7631944444444444 | 0 |
| 0.7638888888888888 | 0 |
| 0.7645833333333334 | 0 |
| 0.7652777777777778 | 0 |
| 0.7659722222222222 | 0 |
| 0.7666666666666666 | 0 |
| 0.7673611111111112 | 0 |
| 0.7680555555555556 | 0 |
| 0.7687499999999999 | 0 |
| 0.7694444444444444 | 0 |
| 0.7701388888888889 | 0 |
| 0.7708333333333334 | 0 |
| 0.7715277777777777 | 0 |
| 0.7722222222222223 | 0 |
| 0.7729166666666667 | 0 |
| 0.7736111111111111 | 0 |
| 0.7743055555555555 | 0 |
| 0.775 | 0 |
| 0.7756944444444445 | 0 |
| 0.7763888888888889 | 0 |
| 0.7770833333333332 | 0 |
| 0.7777777777777778 | 0 |
| 0.7784722222222222 | 0 |
| 0.7791666666666667 | 0 |
| 0.779861111111111 | 0 |
| 0.7805555555555556 | 0 |
| 0.78125 | 0 |
| 0.7819444444444444 | 0 |
| 0.782638888888889 | 0 |
| 0.7833333333333333 | 0 |
| 0.7840277777777778 | 0 |
| 0.7847222222222222 | 0 |
| 0.7854166666666668 | 0 |
| 0.7861111111111111 | 0 |
| 0.7868055555555555 | 0 |
| 0.7875 | 0 |
| 0.7881944444444445 | 0 |
| 0.7888888888888889 | 0 |
| 0.7895833333333333 | 0 |
| 0.7902777777777777 | 0 |
| 0.7909722222222223 | 0 |
| 0.7916666666666666 | 0 |
| 0.7923611111111111 | 0 |
| 0.7930555555555556 | 0 |
| 0.7937500000000001 | 0 |
| 0.7944444444444444 | 0 |
| 0.7951388888888888 | 0 |
| 0.7958333333333334 | 0 |
| 0.7965277777777778 | 0 |
| 0.7972222222222222 | 0 |
| 0.7979166666666666 | 0 |
| 0.7986111111111112 | 0 |
| 0.7993055555555556 | 0 |
| 0.7999999999999999 | 0 |
| 0.8006944444444444 | 0 |
| 0.8013888888888889 | 0 |
| 0.8020833333333334 | 0 |
| 0.8027777777777777 | 0 |
| 0.8034722222222223 | 0 |
| 0.8041666666666667 | 0 |
| 0.8048611111111111 | 0 |
| 0.8055555555555555 | 0 |
| 0.80625 | 0 |
| 0.8069444444444445 | 0 |
| 0.8076388888888889 | 0 |
| 0.8083333333333332 | 0 |
| 0.8090277777777778 | 0 |
| 0.8097222222222222 | 0 |
| 0.8104166666666667 | 0 |
| 0.811111111111111 | 0 |
| 0.8118055555555556 | 0 |
| 0.8125 | 0 |
| 0.8131944444444444 | 0 |
| 0.813888888888889 | 0 |
| 0.8145833333333333 | 0 |
| 0.8152777777777778 | 0 |
| 0.8159722222222222 | 0 |
| 0.8166666666666668 | 0 |
| 0.8173611111111111 | 0 |
| 0.8180555555555555 | 0 |
| 0.81875 | 0 |
| 0.8194444444444445 | 0 |
| 0.8201388888888889 | 0 |
| 0.8208333333333333 | 0 |
| 0.8215277777777777 | 0 |
| 0.8222222222222223 | 0 |
| 0.8229166666666666 | 0 |
| 0.8236111111111111 | 0 |
| 0.8243055555555556 | 0 |
| 0.8250000000000001 | 0 |
| 0.8256944444444444 | 0 |
| 0.8263888888888888 | 0 |
| 0.8270833333333334 | 0 |
| 0.8277777777777778 | 0 |
| 0.8284722222222222 | 0 |
| 0.8291666666666666 | 0 |
| 0.8298611111111112 | 0 |
| 0.8305555555555556 | 0 |
| 0.8312499999999999 | 0 |
| 0.8319444444444444 | 0 |
| 0.8326388888888889 | 0 |
| 0.8333333333333334 | 0 |
| 0.8340277777777777 | 0 |
| 0.8347222222222223 | 0 |
| 0.8354166666666667 | 0 |
| 0.8361111111111111 | 0 |
| 0.8368055555555555 | 0 |
| 0.8375 | 0 |
| 0.8381944444444445 | 0 |
| 0.8388888888888889 | 0 |
| 0.8395833333333332 | 0 |
| 0.8402777777777778 | 0 |
| 0.8409722222222222 | 0 |
| 0.8416666666666667 | 0 |
| 0.842361111111111 | 0 |
| 0.8430555555555556 | 0 |
| 0.84375 | 0 |
| 0.8444444444444444 | 0 |
| 0.845138888888889 | 0 |
| 0.8458333333333333 | 0 |
| 0.8465277777777778 | 0 |
| 0.8472222222222222 | 0 |
| 0.8479166666666668 | 0 |
| 0.8486111111111111 | 0 |
| 0.8493055555555555 | 0 |
| 0.85 | 0 |
| 0.8506944444444445 | 0 |
| 0.8513888888888889 | 0 |
| 0.8520833333333333 | 0 |
| 0.8527777777777777 | 0 |
| 0.8534722222222223 | 0 |
| 0.8541666666666666 | 0 |
| 0.8548611111111111 | 0 |
| 0.8555555555555556 | 0 |
| 0.8562500000000001 | 0 |
| 0.8569444444444444 | 0 |
| 0.8576388888888888 | 0 |
| 0.8583333333333334 | 0 |
| 0.8590277777777778 | 0 |
| 0.8597222222222222 | 0 |
| 0.8604166666666666 | 0 |
| 0.8611111111111112 | 0 |
| 0.8618055555555556 | 0 |
| 0.8624999999999999 | 0 |
| 0.8631944444444444 | 0 |
| 0.8638888888888889 | 0 |
| 0.8645833333333334 | 0 |
| 0.8652777777777777 | 0 |
| 0.8659722222222223 | 0 |
| 0.8666666666666667 | 0 |
| 0.8673611111111111 | 0 |
| 0.8680555555555555 | 0 |
| 0.86875 | 0 |
| 0.8694444444444445 | 0 |
| 0.8701388888888889 | 0 |
| 0.8708333333333332 | 0 |
| 0.8715277777777778 | 0 |
| 0.8722222222222222 | 0 |
| 0.8729166666666667 | 0 |
| 0.873611111111111 | 0 |
| 0.8743055555555556 | 0 |
| 0.875 | 0 |
| 0.8756944444444444 | 0 |
| 0.876388888888889 | 0 |
| 0.8770833333333333 | 0 |
| 0.8777777777777778 | 0 |
| 0.8784722222222222 | 0 |
| 0.8791666666666668 | 0 |
| 0.8798611111111111 | 0 |
| 0.8805555555555555 | 0 |
| 0.88125 | 0 |
| 0.8819444444444445 | 0 |
| 0.8826388888888889 | 0 |
| 0.8833333333333333 | 0 |
| 0.8840277777777777 | 0 |
| 0.8847222222222223 | 0 |
| 0.8854166666666666 | 0 |
| 0.8861111111111111 | 0 |
| 0.8868055555555556 | 0 |
| 0.8875000000000001 | 0 |
| 0.8881944444444444 | 0 |
| 0.8888888888888888 | 0 |
| 0.8895833333333334 | 0 |
| 0.8902777777777778 | 0 |
| 0.8909722222222222 | 0 |
| 0.8916666666666666 | 0 |
| 0.8923611111111112 | 0 |
| 0.8930555555555556 | 0 |
| 0.8937499999999999 | 0 |
| 0.8944444444444444 | 0 |
| 0.8951388888888889 | 0 |
| 0.8958333333333334 | 0 |
| 0.8965277777777777 | 0 |
| 0.8972222222222223 | 0 |
| 0.8979166666666667 | 0 |
| 0.8986111111111111 | 0 |
| 0.8993055555555555 | 0 |
| 0.9 | 0 |
| 0.9006944444444445 | 0 |
| 0.9013888888888889 | 0 |
| 0.9020833333333332 | 0 |
| 0.9027777777777778 | 0 |
| 0.9034722222222222 | 0 |
| 0.9041666666666667 | 0 |
| 0.904861111111111 | 0 |
| 0.9055555555555556 | 0 |
| 0.90625 | 0 |
| 0.9069444444444444 | 0 |
| 0.907638888888889 | 0 |
| 0.9083333333333333 | 0 |
| 0.9090277777777778 | 0 |
| 0.9097222222222222 | 0 |
| 0.9104166666666668 | 0 |
| 0.9111111111111111 | 0 |
| 0.9118055555555555 | 0 |
| 0.9125 | 0 |
| 0.9131944444444445 | 0 |
| 0.9138888888888889 | 0 |
| 0.9145833333333333 | 0 |
| 0.9152777777777777 | 0 |
| 0.9159722222222223 | 0 |
| 0.9166666666666666 | 0 |
| 0.9173611111111111 | 0 |
| 0.9180555555555556 | 0 |
| 0.9187500000000001 | 0 |
| 0.9194444444444444 | 0 |
| 0.9201388888888888 | 0 |
| 0.9208333333333334 | 0 |
| 0.9215277777777778 | 0 |
| 0.9222222222222222 | 0 |
| 0.9229166666666666 | 0 |
| 0.9236111111111112 | 0 |
| 0.9243055555555556 | 0 |
| 0.9249999999999999 | 0 |
| 0.9256944444444444 | 0 |
| 0.9263888888888889 | 0 |
| 0.9270833333333334 | 0 |
| 0.9277777777777777 | 0 |
| 0.9284722222222223 | 0 |
| 0.9291666666666667 | 0 |
| 0.9298611111111111 | 0 |
| 0.9305555555555555 | 0 |
| 0.93125 | 0 |
| 0.9319444444444445 | 0 |
| 0.9326388888888889 | 0 |
| 0.9333333333333332 | 0 |
| 0.9340277777777778 | 0 |
| 0.9347222222222222 | 0 |
| 0.9354166666666667 | 0 |
| 0.936111111111111 | 0 |
| 0.9368055555555556 | 0 |
| 0.9375 | 0 |
| 0.9381944444444444 | 0 |
| 0.938888888888889 | 0 |
| 0.9395833333333333 | 0 |
| 0.9402777777777778 | 0 |
| 0.9409722222222222 | 0 |
| 0.9416666666666668 | 0 |
| 0.9423611111111111 | 0 |
| 0.9430555555555555 | 0 |
| 0.94375 | 0 |
| 0.9444444444444445 | 0 |
| 0.9451388888888889 | 0 |
| 0.9458333333333333 | 0 |
| 0.9465277777777777 | 0 |
| 0.9472222222222223 | 0 |
| 0.9479166666666666 | 0 |
| 0.9486111111111111 | 0 |
| 0.9493055555555556 | 0 |
| 0.9500000000000001 | 0 |
| 0.9506944444444444 | 0 |
| 0.9513888888888888 | 0 |
| 0.9520833333333334 | 0 |
| 0.9527777777777778 | 0 |
| 0.9534722222222222 | 0 |
| 0.9541666666666666 | 0 |
| 0.9548611111111112 | 0 |
| 0.9555555555555556 | 0 |
| 0.9562499999999999 | 0 |
| 0.9569444444444444 | 0 |
| 0.9576388888888889 | 0 |
| 0.9583333333333334 | 0 |
| 0.9590277777777777 | 0 |
| 0.9597222222222223 | 0 |
| 0.9604166666666667 | 0 |
| 0.9611111111111111 | 0 |
| 0.9618055555555555 | 0 |
| 0.9625 | 0 |
| 0.9631944444444445 | 0 |
| 0.9638888888888889 | 0 |
| 0.9645833333333332 | 0 |
| 0.9652777777777778 | 0 |
| 0.9659722222222222 | 0 |
| 0.9666666666666667 | 0 |
| 0.967361111111111 | 0 |
| 0.9680555555555556 | 0 |
| 0.96875 | 0 |
| 0.9694444444444444 | 0 |
| 0.970138888888889 | 0 |
| 0.9708333333333333 | 0 |
| 0.9715277777777778 | 0 |
| 0.9722222222222222 | 0 |
| 0.9729166666666668 | 0 |
| 0.9736111111111111 | 0 |
| 0.9743055555555555 | 0 |
| 0.975 | 0 |
| 0.9756944444444445 | 0 |
| 0.9763888888888889 | 0 |
| 0.9770833333333333 | 0 |
| 0.9777777777777777 | 0 |
| 0.9784722222222223 | 0 |
| 0.9791666666666666 | 0 |
| 0.9798611111111111 | 0 |
| 0.9805555555555556 | 0 |
| 0.9812500000000001 | 0 |
| 0.9819444444444444 | 0 |
| 0.9826388888888888 | 0 |
| 0.9833333333333334 | 0 |
| 0.9840277777777778 | 0 |
| 0.9847222222222222 | 0 |
| 0.9854166666666666 | 0 |
| 0.9861111111111112 | 0 |
| 0.9868055555555556 | 0 |
| 0.9874999999999999 | 0 |
| 0.9881944444444444 | 0 |
| 0.9888888888888889 | 0 |
| 0.9895833333333334 | 0 |
| 0.9902777777777777 | 0 |
| 0.9909722222222223 | 0 |
| 0.9916666666666667 | 0 |
| 0.9923611111111111 | 0 |
| 0.9930555555555555 | 0 |
| 0.99375 | 0 |
| 0.9944444444444445 | 0 |
| 0.9951388888888889 | 0 |
| 0.9958333333333332 | 0 |
| 0.9965277777777778 | 0 |
| 0.9972222222222222 | 0 |
| 0.9979166666666667 | 0 |
| 0.998611111111111 | 0 |
| 0.9993055555555556 | 0 |